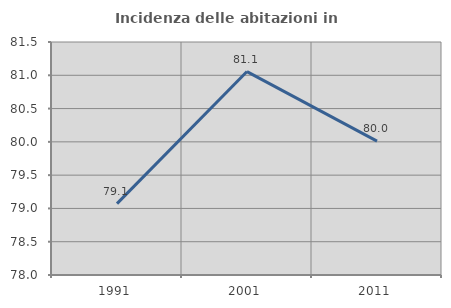
| Category | Incidenza delle abitazioni in proprietà  |
|---|---|
| 1991.0 | 79.072 |
| 2001.0 | 81.056 |
| 2011.0 | 80.011 |